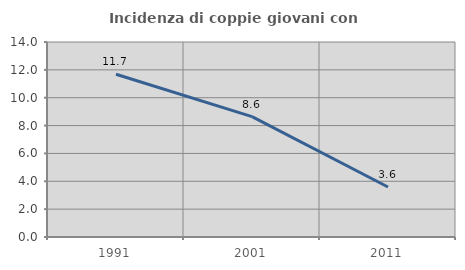
| Category | Incidenza di coppie giovani con figli |
|---|---|
| 1991.0 | 11.688 |
| 2001.0 | 8.642 |
| 2011.0 | 3.59 |